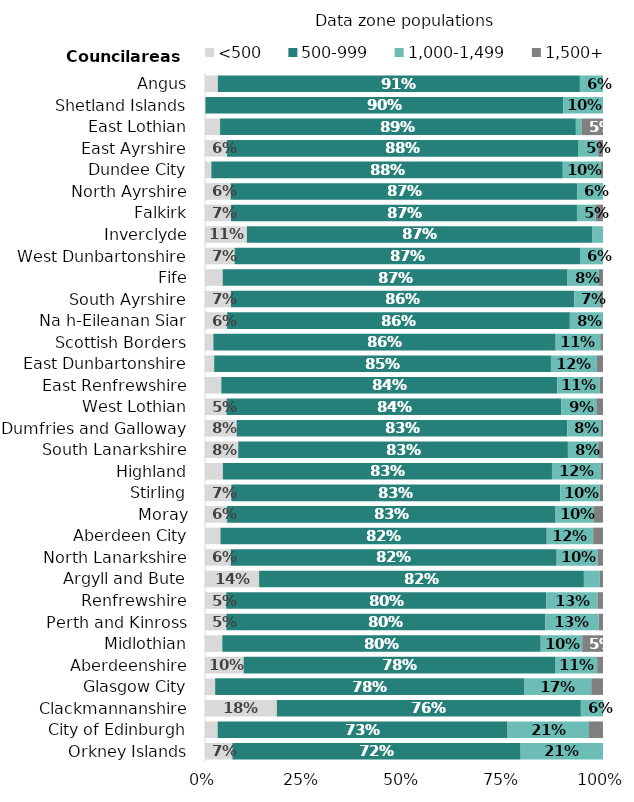
| Category | <500 | 500-999 | 1,000-1,499 | 1,500+ |
|---|---|---|---|---|
| Orkney Islands | 0.069 | 0.724 | 0.207 | 0 |
| City of Edinburgh | 0.032 | 0.727 | 0.206 | 0.035 |
| Clackmannanshire | 0.181 | 0.764 | 0.056 | 0 |
| Glasgow City | 0.025 | 0.776 | 0.169 | 0.029 |
| Aberdeenshire | 0.097 | 0.782 | 0.106 | 0.015 |
| Midlothian | 0.043 | 0.8 | 0.104 | 0.052 |
| Perth and Kinross | 0.054 | 0.801 | 0.134 | 0.011 |
| Renfrewshire | 0.053 | 0.804 | 0.129 | 0.013 |
| Argyll and Bute | 0.136 | 0.816 | 0.04 | 0.008 |
| North Lanarkshire | 0.065 | 0.819 | 0.103 | 0.013 |
| Aberdeen City | 0.039 | 0.82 | 0.117 | 0.025 |
| Moray | 0.056 | 0.825 | 0.095 | 0.024 |
| Stirling | 0.066 | 0.826 | 0.099 | 0.008 |
| Highland | 0.045 | 0.827 | 0.122 | 0.006 |
| South Lanarkshire | 0.084 | 0.828 | 0.077 | 0.012 |
| Dumfries and Galloway | 0.08 | 0.831 | 0.085 | 0.005 |
| West Lothian | 0.054 | 0.841 | 0.088 | 0.017 |
| East Renfrewshire | 0.041 | 0.844 | 0.107 | 0.008 |
| East Dunbartonshire | 0.023 | 0.846 | 0.115 | 0.015 |
| Scottish Borders | 0.021 | 0.86 | 0.112 | 0.007 |
| Na h-Eileanan Siar | 0.056 | 0.861 | 0.083 | 0 |
| South Ayrshire | 0.065 | 0.863 | 0.065 | 0.007 |
| Fife | 0.045 | 0.866 | 0.079 | 0.01 |
| West Dunbartonshire | 0.074 | 0.868 | 0.058 | 0 |
| Inverclyde | 0.105 | 0.868 | 0.026 | 0 |
| Falkirk | 0.065 | 0.869 | 0.047 | 0.019 |
| North Ayrshire | 0.065 | 0.871 | 0.065 | 0 |
| Dundee City | 0.016 | 0.883 | 0.096 | 0.005 |
| East Ayrshire | 0.055 | 0.883 | 0.049 | 0.012 |
| East Lothian | 0.038 | 0.894 | 0.015 | 0.053 |
| Shetland Islands | 0 | 0.9 | 0.1 | 0 |
| Angus | 0.032 | 0.91 | 0.058 | 0 |